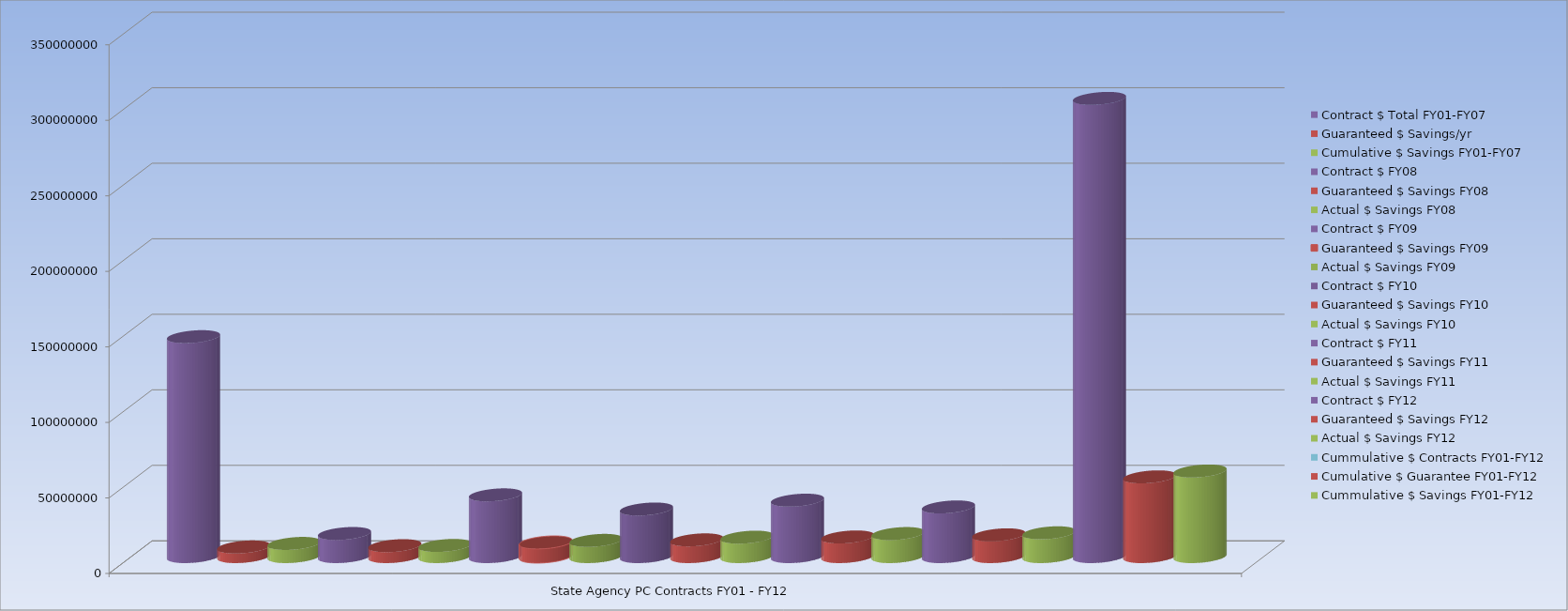
| Category | Contract $ Total FY01-FY07 | Guaranteed $ Savings/yr | Cumulative $ Savings FY01-FY07 | Contract $ FY08 | Guaranteed $ Savings FY08 | Actual $ Savings FY08 | Contract $ FY09 | Guaranteed $ Savings FY09 | Actual $ Savings FY09 | Contract $ FY10 | Guaranteed $ Savings FY10 | Actual $ Savings FY10 | Contract $ FY11 | Guaranteed $ Savings FY11 | Actual $ Savings FY11 | Contract $ FY12 | Guaranteed $ Savings FY12 | Actual $ Savings FY12 | Cummulative $ Contracts FY01-FY12 | Cumulative $ Guarantee FY01-FY12 | Cummulative $ Savings FY01-FY12 |
|---|---|---|---|---|---|---|---|---|---|---|---|---|---|---|---|---|---|---|---|---|---|
| State Agency PC Contracts FY01 - FY12 | 145570918 | 6349037.625 | 8694194.472 | 15262642 | 7206165.605 | 7358839.672 | 40843505 | 9353047.1 | 10700998.25 | 31460760 | 11043231.6 | 12835210 | 37329703 | 12978614.1 | 15218132.917 | 32852392 | 14381815.865 | 15736707.672 | 303319920 | 52767672.895 | 56643167.984 |